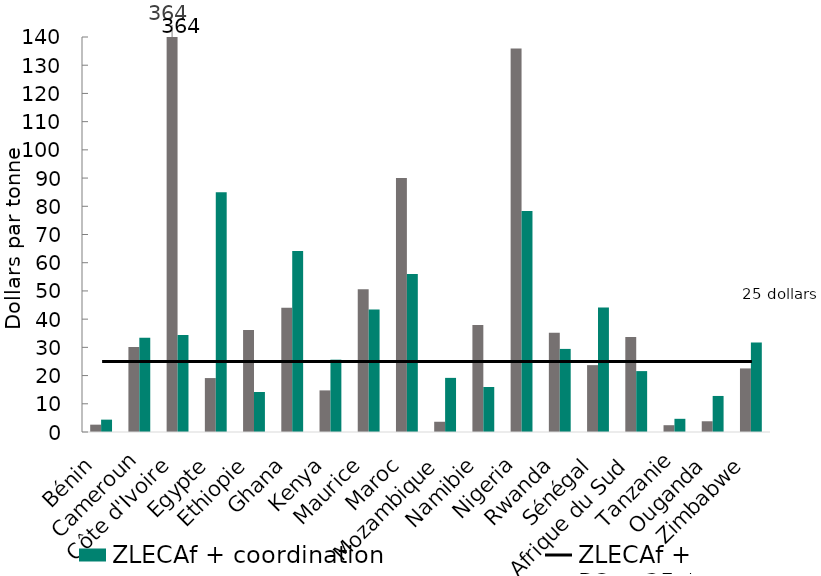
| Category | Series 1 | Series 2 | ZLECAf + engagements | ZLECAf + coordination |
|---|---|---|---|---|
| Bénin |  |  | 2.599 | 4.378 |
| Cameroun |  |  | 30.134 | 33.375 |
| Côte d'Ivoire |  |  | 363.756 | 34.413 |
| Egypte |  |  | 19.118 | 84.998 |
| Ethiopie |  |  | 36.181 | 14.186 |
| Ghana |  |  | 44.002 | 64.189 |
| Kenya |  |  | 14.748 | 25.635 |
| Maurice |  |  | 50.578 | 43.38 |
| Maroc |  |  | 90.066 | 56.016 |
| Mozambique |  |  | 3.631 | 19.183 |
| Namibie |  |  | 37.962 | 15.954 |
| Nigeria |  |  | 135.949 | 78.303 |
| Rwanda |  |  | 35.146 | 29.45 |
| Sénégal |  |  | 23.702 | 44.101 |
| Afrique du Sud |  |  | 33.637 | 21.585 |
| Tanzanie |  |  | 2.408 | 4.676 |
| Ouganda |  |  | 3.806 | 12.774 |
| Zimbabwe |  |  | 22.536 | 31.726 |